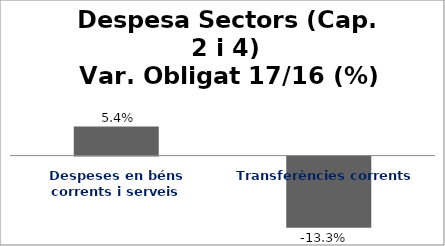
| Category | Series 0 |
|---|---|
| Despeses en béns corrents i serveis | 0.054 |
| Transferències corrents | -0.133 |